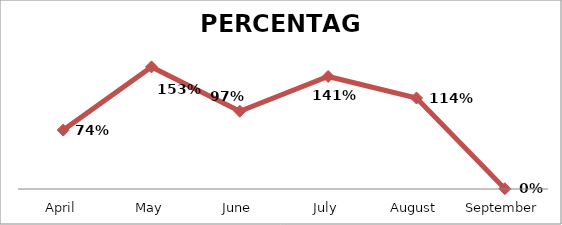
| Category | PERCENTAGE |
|---|---|
| April | 0.736 |
| May | 1.526 |
| June | 0.972 |
| July | 1.407 |
| August | 1.137 |
| September | 0.004 |